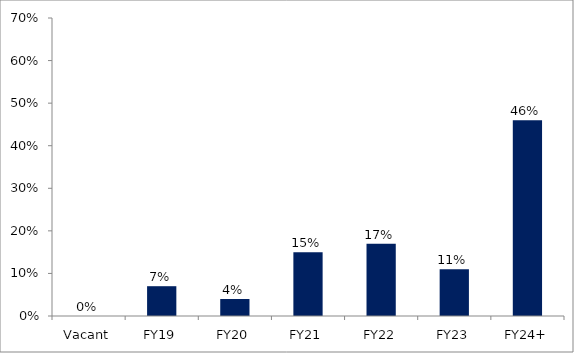
| Category | Series 0 |
|---|---|
| Vacant | 0 |
| FY19 | 0.07 |
| FY20 | 0.04 |
| FY21 | 0.15 |
| FY22 | 0.17 |
| FY23 | 0.11 |
| FY24+ | 0.46 |